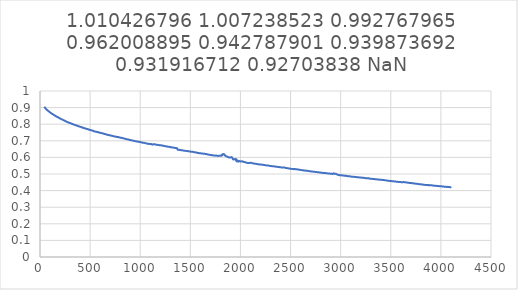
| Category | 1.010426796 |
|---|---|
| 42.6115265789308 | 0.905 |
| 47.3459460682923 | 0.901 |
| 52.080368193064 | 0.898 |
| 56.8147819223978 | 0.894 |
| 61.5491790028845 | 0.891 |
| 66.2835925270667 | 0.888 |
| 71.0180053884512 | 0.886 |
| 75.7524161509762 | 0.883 |
| 80.4868064141149 | 0.88 |
| 85.2212255720779 | 0.878 |
| 89.9555989654366 | 0.876 |
| 94.6899918797663 | 0.873 |
| 99.4244019005891 | 0.871 |
| 104.158789970183 | 0.869 |
| 108.893202405483 | 0.867 |
| 113.627562416641 | 0.865 |
| 118.361975135997 | 0.863 |
| 123.096343826648 | 0.862 |
| 127.830744568303 | 0.86 |
| 132.565132590554 | 0.858 |
| 137.299504248015 | 0.856 |
| 142.033897146563 | 0.855 |
| 146.76828368541 | 0.852 |
| 151.502642544562 | 0.851 |
| 156.23702419133 | 0.849 |
| 160.971399999167 | 0.847 |
| 165.705798405249 | 0.846 |
| 170.440168973827 | 0.844 |
| 175.174535802332 | 0.843 |
| 179.908915176651 | 0.841 |
| 184.643291347448 | 0.84 |
| 189.377650096134 | 0.838 |
| 194.112046829441 | 0.837 |
| 198.846403400362 | 0.834 |
| 203.580776683255 | 0.834 |
| 208.315159292658 | 0.832 |
| 213.049518988198 | 0.831 |
| 217.78387750017 | 0.829 |
| 222.518266406152 | 0.828 |
| 227.252620404787 | 0.827 |
| 231.987003456055 | 0.825 |
| 236.721373061999 | 0.824 |
| 241.455741342346 | 0.822 |
| 246.1901012746 | 0.821 |
| 250.924445157679 | 0.82 |
| 255.658818803533 | 0.818 |
| 260.393196315706 | 0.816 |
| 265.127644794577 | 0.815 |
| 269.862101889818 | 0.814 |
| 274.596581409715 | 0.813 |
| 279.331035680176 | 0.812 |
| 284.065502070366 | 0.81 |
| 288.79995798204 | 0.809 |
| 293.534420032483 | 0.808 |
| 298.268885254887 | 0.807 |
| 303.003323349927 | 0.806 |
| 307.73775658445 | 0.805 |
| 312.472210207894 | 0.804 |
| 317.206646030485 | 0.803 |
| 321.941079296571 | 0.801 |
| 326.675521668234 | 0.801 |
| 331.409941678365 | 0.799 |
| 336.144382093198 | 0.798 |
| 340.878795585818 | 0.797 |
| 345.613195901389 | 0.796 |
| 350.347627431575 | 0.795 |
| 355.082053217515 | 0.794 |
| 359.816464090507 | 0.793 |
| 364.5508648006 | 0.793 |
| 369.285266126148 | 0.791 |
| 374.019699550042 | 0.79 |
| 378.754099344843 | 0.789 |
| 383.488481165202 | 0.788 |
| 388.222892811457 | 0.787 |
| 392.957287871989 | 0.786 |
| 397.691706177783 | 0.786 |
| 402.426074458131 | 0.784 |
| 407.160494278891 | 0.784 |
| 411.894883374244 | 0.782 |
| 416.629256167928 | 0.782 |
| 421.363651970162 | 0.781 |
| 426.098049145334 | 0.779 |
| 430.832440102832 | 0.779 |
| 435.566824353449 | 0.777 |
| 440.301216668104 | 0.776 |
| 445.035598740957 | 0.776 |
| 449.769963533727 | 0.775 |
| 454.504346979518 | 0.774 |
| 459.238751729521 | 0.773 |
| 463.973111172566 | 0.772 |
| 468.707487895694 | 0.771 |
| 473.441859916115 | 0.771 |
| 478.176261872899 | 0.77 |
| 482.910640331926 | 0.768 |
| 487.644986124495 | 0.767 |
| 492.379361237971 | 0.767 |
| 497.113753221228 | 0.766 |
| 501.848109476532 | 0.765 |
| 506.582481575857 | 0.764 |
| 511.316854211733 | 0.764 |
| 516.051235527102 | 0.763 |
| 520.785611808366 | 0.762 |
| 525.519970067843 | 0.761 |
| 530.254339831596 | 0.76 |
| 534.988715418499 | 0.758 |
| 539.723080195488 | 0.758 |
| 544.457459459341 | 0.757 |
| 549.191821143273 | 0.756 |
| 553.926182574712 | 0.755 |
| 558.660561807003 | 0.755 |
| 563.394897768072 | 0.754 |
| 568.12927835752 | 0.753 |
| 572.863637595414 | 0.753 |
| 577.598004597509 | 0.752 |
| 582.332379284901 | 0.751 |
| 587.066730395632 | 0.75 |
| 591.801076787875 | 0.75 |
| 596.535453653031 | 0.749 |
| 601.269821002307 | 0.749 |
| 606.004166337229 | 0.747 |
| 610.738532345127 | 0.747 |
| 615.472902124661 | 0.746 |
| 620.207259311038 | 0.746 |
| 624.94162274665 | 0.745 |
| 629.675983483729 | 0.744 |
| 634.410339912622 | 0.743 |
| 639.144703537605 | 0.742 |
| 643.879069198324 | 0.741 |
| 648.613410572241 | 0.741 |
| 653.347774796899 | 0.74 |
| 658.082124771405 | 0.739 |
| 662.816479164563 | 0.738 |
| 667.550838891664 | 0.737 |
| 672.285213926236 | 0.737 |
| 677.019554085024 | 0.736 |
| 681.753929908641 | 0.734 |
| 686.488278194592 | 0.735 |
| 691.222651477484 | 0.733 |
| 695.956983430205 | 0.733 |
| 700.691342305138 | 0.733 |
| 705.425702631913 | 0.732 |
| 710.160075536064 | 0.73 |
| 714.894417809493 | 0.73 |
| 719.628792528447 | 0.73 |
| 724.363147316128 | 0.729 |
| 729.097482393466 | 0.728 |
| 733.831850105702 | 0.727 |
| 738.566216713275 | 0.727 |
| 743.300563279107 | 0.726 |
| 748.034920244551 | 0.726 |
| 752.769256947323 | 0.726 |
| 757.50364138731 | 0.724 |
| 762.237971320076 | 0.724 |
| 766.972330589532 | 0.723 |
| 771.706685314088 | 0.723 |
| 776.441052489773 | 0.722 |
| 781.175515329261 | 0.722 |
| 785.910099239798 | 0.721 |
| 790.644673539768 | 0.721 |
| 795.379245519946 | 0.72 |
| 800.113782450749 | 0.719 |
| 804.848345072854 | 0.719 |
| 809.582890209725 | 0.718 |
| 814.317418760872 | 0.718 |
| 819.05193905861 | 0.717 |
| 823.786481354919 | 0.716 |
| 828.520993541274 | 0.716 |
| 833.25550503327 | 0.715 |
| 837.990001328262 | 0.715 |
| 842.724495713765 | 0.713 |
| 847.45899241906 | 0.712 |
| 852.193486457383 | 0.712 |
| 856.927964509657 | 0.711 |
| 861.662445355149 | 0.71 |
| 866.396912471261 | 0.71 |
| 871.131374647951 | 0.709 |
| 875.86586264219 | 0.708 |
| 880.600300705669 | 0.708 |
| 885.334766480404 | 0.707 |
| 890.069210887804 | 0.706 |
| 894.803659540264 | 0.705 |
| 899.538133347476 | 0.705 |
| 904.272560727287 | 0.704 |
| 909.006992967614 | 0.703 |
| 913.741452619361 | 0.703 |
| 918.475871509048 | 0.703 |
| 923.210286437731 | 0.702 |
| 927.944716847473 | 0.701 |
| 932.679156378575 | 0.7 |
| 937.413567251567 | 0.699 |
| 942.147986441091 | 0.699 |
| 946.882398623897 | 0.698 |
| 951.616835235533 | 0.698 |
| 956.351243473114 | 0.697 |
| 961.085639196443 | 0.697 |
| 965.820052468132 | 0.696 |
| 970.554446297753 | 0.695 |
| 975.288865503058 | 0.695 |
| 980.02327901146 | 0.694 |
| 984.75767298311 | 0.694 |
| 989.492078159197 | 0.693 |
| 994.226455371533 | 0.693 |
| 998.960852373115 | 0.692 |
| 1003.69526577105 | 0.693 |
| 1008.42963761788 | 0.691 |
| 1013.1640314475 | 0.69 |
| 1017.89842114253 | 0.689 |
| 1022.63282655533 | 0.688 |
| 1027.36722636591 | 0.689 |
| 1032.10160695536 | 0.689 |
| 1036.83597196906 | 0.688 |
| 1041.57037252135 | 0.687 |
| 1046.3047376613 | 0.686 |
| 1051.03913384227 | 0.686 |
| 1055.77350161763 | 0.685 |
| 1060.5078888824 | 0.684 |
| 1065.24228761988 | 0.684 |
| 1069.9766381625 | 0.684 |
| 1074.71102896219 | 0.682 |
| 1079.4453919875 | 0.682 |
| 1084.17978387607 | 0.681 |
| 1088.91416418146 | 0.681 |
| 1093.64853433973 | 0.681 |
| 1098.38290565001 | 0.68 |
| 1103.11727542955 | 0.68 |
| 1107.85164554048 | 0.68 |
| 1112.58603387835 | 0.679 |
| 1117.32038732465 | 0.678 |
| 1122.05476826128 | 0.677 |
| 1126.78912890367 | 0.677 |
| 1131.52349036667 | 0.68 |
| 1136.25788309163 | 0.68 |
| 1140.99223862102 | 0.679 |
| 1145.72661217218 | 0.679 |
| 1150.46097417173 | 0.678 |
| 1155.19532480904 | 0.677 |
| 1159.92970427804 | 0.676 |
| 1164.66407816061 | 0.676 |
| 1169.39843301141 | 0.676 |
| 1174.13280073943 | 0.675 |
| 1178.86714616904 | 0.675 |
| 1183.60151277661 | 0.675 |
| 1188.33589775315 | 0.674 |
| 1193.07026399776 | 0.673 |
| 1197.80460169473 | 0.673 |
| 1202.53898955917 | 0.672 |
| 1207.27334826051 | 0.673 |
| 1212.00768840352 | 0.672 |
| 1216.74206848798 | 0.672 |
| 1221.47643171844 | 0.671 |
| 1226.21077329751 | 0.67 |
| 1230.94515185122 | 0.67 |
| 1235.6795132511 | 0.67 |
| 1240.41387034279 | 0.669 |
| 1245.14823314717 | 0.668 |
| 1249.88259222725 | 0.667 |
| 1254.61695537881 | 0.667 |
| 1259.35130636329 | 0.667 |
| 1264.08565333943 | 0.666 |
| 1268.82003476526 | 0.665 |
| 1273.55437329862 | 0.665 |
| 1278.28872410951 | 0.664 |
| 1283.02310338915 | 0.664 |
| 1287.75744269577 | 0.664 |
| 1292.49182563657 | 0.663 |
| 1297.22624814008 | 0.663 |
| 1301.96083511211 | 0.662 |
| 1306.69540993285 | 0.661 |
| 1311.42997501678 | 0.661 |
| 1316.16453509816 | 0.66 |
| 1320.8990681153 | 0.66 |
| 1325.63363946424 | 0.66 |
| 1330.3681731284 | 0.659 |
| 1335.10268979653 | 0.658 |
| 1339.83721028364 | 0.658 |
| 1344.57175341633 | 0.658 |
| 1349.30625577119 | 0.657 |
| 1354.04076972501 | 0.657 |
| 1358.77526497846 | 0.656 |
| 1363.50975914303 | 0.655 |
| 1368.24424170864 | 0.655 |
| 1372.97873932923 | 0.647 |
| 1377.71321001182 | 0.647 |
| 1382.44770049944 | 0.646 |
| 1387.18218581093 | 0.646 |
| 1391.91665166457 | 0.645 |
| 1396.65111440937 | 0.644 |
| 1401.38554977432 | 0.644 |
| 1406.12002020442 | 0.644 |
| 1410.85448313859 | 0.643 |
| 1415.58891064465 | 0.643 |
| 1420.32335328459 | 0.643 |
| 1425.05782092147 | 0.642 |
| 1429.79225881136 | 0.642 |
| 1434.5266733613 | 0.641 |
| 1439.26112152455 | 0.64 |
| 1443.99554874655 | 0.64 |
| 1448.72998930341 | 0.64 |
| 1453.46438797777 | 0.639 |
| 1458.19881464744 | 0.639 |
| 1462.93325267935 | 0.639 |
| 1467.6676609485 | 0.638 |
| 1472.40206118516 | 0.638 |
| 1477.13650237326 | 0.637 |
| 1481.87090658671 | 0.637 |
| 1486.6053160552 | 0.636 |
| 1491.33970063722 | 0.636 |
| 1496.07412006346 | 0.636 |
| 1500.80852972132 | 0.635 |
| 1505.54293485006 | 0.635 |
| 1510.27730783312 | 0.634 |
| 1515.01172059982 | 0.634 |
| 1519.74612673854 | 0.634 |
| 1524.48050696503 | 0.633 |
| 1529.21490548158 | 0.633 |
| 1533.94928952704 | 0.633 |
| 1538.6836829937 | 0.631 |
| 1543.41808515564 | 0.631 |
| 1548.15246481401 | 0.631 |
| 1552.88685111615 | 0.63 |
| 1557.62123544567 | 0.629 |
| 1562.3556248882 | 0.629 |
| 1567.08998881302 | 0.628 |
| 1571.82437146977 | 0.628 |
| 1576.55876886587 | 0.627 |
| 1581.29315463145 | 0.626 |
| 1586.02753312204 | 0.626 |
| 1590.76191229121 | 0.625 |
| 1595.49628110811 | 0.625 |
| 1600.23065961448 | 0.624 |
| 1604.96501877347 | 0.625 |
| 1609.69941708486 | 0.624 |
| 1614.4337760387 | 0.624 |
| 1619.168168811 | 0.624 |
| 1623.90254540788 | 0.623 |
| 1628.63689708673 | 0.622 |
| 1633.3712735258 | 0.622 |
| 1638.10563156434 | 0.622 |
| 1642.84000195933 | 0.621 |
| 1647.57438308533 | 0.621 |
| 1652.30876050282 | 0.621 |
| 1657.04311398069 | 0.621 |
| 1661.77749728445 | 0.62 |
| 1666.51184351888 | 0.619 |
| 1671.24624033109 | 0.618 |
| 1675.9805779176 | 0.618 |
| 1680.71495801784 | 0.617 |
| 1685.44931967021 | 0.616 |
| 1690.18368015479 | 0.616 |
| 1694.918051686 | 0.615 |
| 1699.65240481669 | 0.615 |
| 1704.38678925668 | 0.614 |
| 1709.12113320288 | 0.615 |
| 1713.85550078887 | 0.613 |
| 1718.58987519221 | 0.613 |
| 1723.32421940668 | 0.613 |
| 1728.05859425189 | 0.612 |
| 1732.79296638277 | 0.612 |
| 1737.52733030759 | 0.612 |
| 1742.26169145497 | 0.611 |
| 1746.9960557901 | 0.611 |
| 1751.7304063485 | 0.611 |
| 1756.46476358222 | 0.611 |
| 1761.19913014245 | 0.611 |
| 1765.93348133208 | 0.61 |
| 1770.66784105918 | 0.61 |
| 1775.40221497331 | 0.609 |
| 1780.136573722 | 0.609 |
| 1784.87093224975 | 0.61 |
| 1789.60529969371 | 0.609 |
| 1794.33965517575 | 0.61 |
| 1799.0740084169 | 0.611 |
| 1803.80837578196 | 0.61 |
| 1808.54272648239 | 0.611 |
| 1813.27709146453 | 0.611 |
| 1818.01166387079 | 0.618 |
| 1822.74624950144 | 0.615 |
| 1827.48079163994 | 0.62 |
| 1832.21535473548 | 0.62 |
| 1836.94991352282 | 0.619 |
| 1841.68445206328 | 0.617 |
| 1846.41896873141 | 0.611 |
| 1851.15349128582 | 0.609 |
| 1855.88802042086 | 0.607 |
| 1860.62252495348 | 0.606 |
| 1865.35704430436 | 0.605 |
| 1870.0915572482 | 0.604 |
| 1874.82605417443 | 0.602 |
| 1879.5605469345 | 0.601 |
| 1884.29501862707 | 0.6 |
| 1889.02950327576 | 0.6 |
| 1893.76399553084 | 0.6 |
| 1898.49846572423 | 0.599 |
| 1903.23294791109 | 0.6 |
| 1907.96739795227 | 0.602 |
| 1912.70187117559 | 0.6 |
| 1917.436317887 | 0.599 |
| 1922.17078112101 | 0.594 |
| 1926.90521056812 | 0.588 |
| 1931.63967855218 | 0.588 |
| 1936.37410440125 | 0.588 |
| 1941.10853907183 | 0.59 |
| 1945.84298867115 | 0.588 |
| 1955.31186350407 | 0.59 |
| 1960.04629107325 | 0.577 |
| 1964.78069411892 | 0.584 |
| 1969.51513656949 | 0.576 |
| 1974.24954755294 | 0.576 |
| 1978.98396754729 | 0.574 |
| 1983.71837603737 | 0.579 |
| 1988.45280185487 | 0.578 |
| 1993.18720722033 | 0.576 |
| 1997.92162156512 | 0.577 |
| 2002.65602610997 | 0.576 |
| 2007.39041856665 | 0.576 |
| 2012.12481523684 | 0.575 |
| 2016.85922551015 | 0.577 |
| 2021.59362044444 | 0.575 |
| 2026.32804136986 | 0.575 |
| 2031.06243807161 | 0.573 |
| 2035.79682102819 | 0.572 |
| 2040.5312037165 | 0.573 |
| 2045.26561239594 | 0.571 |
| 2050.00000595729 | 0.571 |
| 2054.73437635228 | 0.568 |
| 2059.4687958732 | 0.567 |
| 2092.60946479673 | 0.567 |
| 2097.343847848 | 0.568 |
| 2102.07821972639 | 0.567 |
| 2106.81261137825 | 0.567 |
| 2111.54698088951 | 0.566 |
| 2116.28136657619 | 0.565 |
| 2121.01572556159 | 0.565 |
| 2125.75011355228 | 0.564 |
| 2130.48448068062 | 0.564 |
| 2135.21886641464 | 0.563 |
| 2139.95321430607 | 0.562 |
| 2144.68758768364 | 0.562 |
| 2149.42196819419 | 0.561 |
| 2154.15635182935 | 0.561 |
| 2158.89070309789 | 0.561 |
| 2163.62508187254 | 0.56 |
| 2168.35944978992 | 0.559 |
| 2173.093824572 | 0.559 |
| 2177.82819378342 | 0.558 |
| 2182.56254135923 | 0.559 |
| 2187.29692232742 | 0.557 |
| 2192.03128323809 | 0.558 |
| 2196.76566521626 | 0.557 |
| 2201.50001852053 | 0.557 |
| 2206.23438591715 | 0.557 |
| 2210.96876268762 | 0.556 |
| 2215.70312209911 | 0.556 |
| 2220.43747922236 | 0.556 |
| 2225.17185297868 | 0.556 |
| 2229.90621581462 | 0.555 |
| 2234.6405611022 | 0.555 |
| 2239.37494667841 | 0.554 |
| 2244.10930902514 | 0.553 |
| 2248.84366043571 | 0.553 |
| 2253.57800970007 | 0.552 |
| 2258.31238610758 | 0.552 |
| 2263.04675194189 | 0.551 |
| 2267.78110082752 | 0.551 |
| 2272.51548200086 | 0.552 |
| 2277.2498207078 | 0.551 |
| 2281.9841782098 | 0.55 |
| 2286.71854761059 | 0.55 |
| 2291.45289045213 | 0.549 |
| 2296.18726184131 | 0.549 |
| 2300.92162586082 | 0.548 |
| 2305.65597559861 | 0.548 |
| 2310.39033920782 | 0.548 |
| 2315.12470565758 | 0.547 |
| 2319.85905110297 | 0.547 |
| 2324.59341905192 | 0.546 |
| 2329.32777574909 | 0.546 |
| 2334.06231948146 | 0.546 |
| 2338.79689232958 | 0.546 |
| 2343.5314505646 | 0.545 |
| 2348.26603398593 | 0.544 |
| 2353.00057658207 | 0.545 |
| 2357.73511256602 | 0.545 |
| 2362.46963680899 | 0.543 |
| 2367.20417894749 | 0.543 |
| 2371.93869062885 | 0.542 |
| 2376.67322344084 | 0.542 |
| 2381.4077381837 | 0.542 |
| 2386.14223286904 | 0.542 |
| 2390.87674704379 | 0.541 |
| 2395.61122020399 | 0.541 |
| 2400.34572800325 | 0.54 |
| 2405.08021274663 | 0.54 |
| 2409.81467867917 | 0.539 |
| 2414.54915665254 | 0.54 |
| 2419.28362618313 | 0.539 |
| 2424.01812288843 | 0.539 |
| 2428.75255953162 | 0.538 |
| 2433.48704115038 | 0.539 |
| 2438.22147476364 | 0.538 |
| 2442.95594105915 | 0.538 |
| 2447.69037601379 | 0.537 |
| 2452.42484737496 | 0.536 |
| 2457.15927499149 | 0.536 |
| 2461.89371976185 | 0.536 |
| 2466.62816469002 | 0.535 |
| 2471.36259535225 | 0.534 |
| 2476.09701880262 | 0.534 |
| 2480.83144657695 | 0.533 |
| 2485.56586035363 | 0.533 |
| 2490.30029890632 | 0.533 |
| 2495.03469941126 | 0.532 |
| 2499.76912204102 | 0.532 |
| 2504.503551425 | 0.531 |
| 2509.23796950986 | 0.531 |
| 2513.97238115612 | 0.53 |
| 2518.70677531714 | 0.53 |
| 2523.44117132453 | 0.53 |
| 2528.17557937274 | 0.53 |
| 2532.91000899343 | 0.529 |
| 2537.64438434363 | 0.53 |
| 2542.37880738369 | 0.53 |
| 2547.1131965106 | 0.529 |
| 2551.84758413833 | 0.529 |
| 2556.58197471709 | 0.529 |
| 2561.31636700018 | 0.528 |
| 2566.05078042968 | 0.528 |
| 2570.78516239207 | 0.527 |
| 2575.51956543773 | 0.526 |
| 2580.25393308684 | 0.526 |
| 2584.98834392827 | 0.525 |
| 2589.72272282916 | 0.525 |
| 2594.45711362885 | 0.525 |
| 2599.1914903362 | 0.525 |
| 2603.92586830602 | 0.524 |
| 2608.66025847447 | 0.524 |
| 2613.39463707553 | 0.523 |
| 2618.12902249393 | 0.522 |
| 2622.86338356241 | 0.522 |
| 2627.59778804414 | 0.522 |
| 2632.33216669254 | 0.522 |
| 2637.06652687728 | 0.521 |
| 2641.80091863961 | 0.521 |
| 2646.53528400049 | 0.521 |
| 2651.26964964543 | 0.52 |
| 2656.00403858297 | 0.52 |
| 2660.73839516967 | 0.52 |
| 2665.47277675332 | 0.519 |
| 2670.20715841587 | 0.519 |
| 2674.94153005755 | 0.519 |
| 2679.67589515015 | 0.518 |
| 2684.41025912232 | 0.517 |
| 2689.14462705548 | 0.517 |
| 2693.87899921793 | 0.516 |
| 2698.61336797171 | 0.516 |
| 2703.3477276199 | 0.516 |
| 2708.08211646276 | 0.515 |
| 2712.81645917806 | 0.515 |
| 2760.1601249066 | 0.512 |
| 2764.89448850002 | 0.511 |
| 2769.62885248797 | 0.511 |
| 2774.36321066854 | 0.51 |
| 2779.09756491967 | 0.511 |
| 2783.83194423087 | 0.51 |
| 2788.56630667228 | 0.509 |
| 2793.30066488442 | 0.509 |
| 2798.03502820956 | 0.509 |
| 2802.76939380716 | 0.508 |
| 2807.50375566468 | 0.507 |
| 2812.23810639667 | 0.507 |
| 2816.97247028993 | 0.507 |
| 2821.70684212098 | 0.507 |
| 2826.44118496252 | 0.506 |
| 2831.1755702389 | 0.507 |
| 2835.90992305396 | 0.506 |
| 2840.64428761002 | 0.506 |
| 2845.37864332877 | 0.505 |
| 2850.11313990782 | 0.505 |
| 2854.84771191956 | 0.505 |
| 2859.58226846602 | 0.504 |
| 2864.31682518607 | 0.504 |
| 2869.0513730846 | 0.504 |
| 2873.78591519154 | 0.503 |
| 2878.52045114392 | 0.503 |
| 2883.25499243026 | 0.503 |
| 2887.98950019796 | 0.503 |
| 2892.72403226825 | 0.503 |
| 2897.4585247127 | 0.502 |
| 2902.19305687767 | 0.502 |
| 2906.92755569761 | 0.501 |
| 2911.66203578562 | 0.501 |
| 2916.39652928739 | 0.501 |
| 2921.13101369936 | 0.5 |
| 2925.865513261 | 0.501 |
| 2930.59996339687 | 0.504 |
| 2935.33444159117 | 0.502 |
| 2940.06892980634 | 0.501 |
| 2944.80336195198 | 0.501 |
| 2949.53782403399 | 0.501 |
| 2954.27228802548 | 0.501 |
| 2959.00673413722 | 0.499 |
| 2963.74118231625 | 0.497 |
| 2968.47562558743 | 0.496 |
| 2973.21009961557 | 0.495 |
| 2977.94450865798 | 0.494 |
| 2982.67896486949 | 0.494 |
| 2987.41339128667 | 0.493 |
| 2992.14783121229 | 0.493 |
| 2996.88226174828 | 0.492 |
| 3001.61667224253 | 0.492 |
| 3006.35109228422 | 0.492 |
| 3011.08550677104 | 0.492 |
| 3015.81992678117 | 0.492 |
| 3020.55433825384 | 0.491 |
| 3025.28877107806 | 0.491 |
| 3030.02316123073 | 0.491 |
| 3034.75758351331 | 0.49 |
| 3039.49200704258 | 0.49 |
| 3044.22638431804 | 0.489 |
| 3048.96081007242 | 0.489 |
| 3053.69521614802 | 0.489 |
| 3058.42959037776 | 0.488 |
| 3063.16402662644 | 0.487 |
| 3067.89840405971 | 0.487 |
| 3072.632800146 | 0.487 |
| 3077.36720279714 | 0.487 |
| 3082.10159506445 | 0.486 |
| 3086.83598475948 | 0.486 |
| 3091.57037177175 | 0.486 |
| 3096.30474742178 | 0.486 |
| 3101.03914174061 | 0.484 |
| 3105.77353640662 | 0.484 |
| 3110.50789775915 | 0.484 |
| 3115.24228739106 | 0.484 |
| 3119.97667845902 | 0.483 |
| 3124.71105019539 | 0.484 |
| 3129.44544161053 | 0.483 |
| 3134.17981774976 | 0.483 |
| 3138.91420129024 | 0.482 |
| 3143.64856999667 | 0.482 |
| 3148.38295461025 | 0.481 |
| 3153.11735547815 | 0.482 |
| 3157.85171840878 | 0.481 |
| 3162.58610370093 | 0.481 |
| 3167.32047974548 | 0.481 |
| 3172.05485001422 | 0.481 |
| 3176.78920489659 | 0.48 |
| 3181.5235995626 | 0.48 |
| 3186.25795218829 | 0.479 |
| 3190.99232269375 | 0.48 |
| 3195.72669744427 | 0.479 |
| 3200.46106867564 | 0.479 |
| 3205.1954663558 | 0.478 |
| 3209.92983324743 | 0.478 |
| 3214.66419092302 | 0.477 |
| 3219.39855757793 | 0.478 |
| 3224.13293336999 | 0.477 |
| 3228.86730363873 | 0.477 |
| 3233.60166407597 | 0.476 |
| 3238.33603537047 | 0.476 |
| 3243.07038488733 | 0.476 |
| 3247.80477622357 | 0.475 |
| 3252.53911627189 | 0.475 |
| 3257.27350412055 | 0.475 |
| 3262.00787131202 | 0.474 |
| 3266.74221326983 | 0.475 |
| 3271.47657825197 | 0.475 |
| 3276.21096161885 | 0.474 |
| 3280.94532961515 | 0.474 |
| 3285.67970048356 | 0.473 |
| 3290.41405718073 | 0.472 |
| 3295.14841834389 | 0.472 |
| 3299.88278479366 | 0.471 |
| 3304.61712965515 | 0.472 |
| 3309.35150489488 | 0.471 |
| 3314.08587227571 | 0.471 |
| 3318.82023241312 | 0.47 |
| 3323.55457779538 | 0.47 |
| 3328.28896070462 | 0.47 |
| 3333.02330009015 | 0.469 |
| 3337.75768064803 | 0.469 |
| 3342.49203516744 | 0.469 |
| 3347.22639150165 | 0.469 |
| 3351.96077093909 | 0.468 |
| 3356.69510731046 | 0.468 |
| 3361.42948960425 | 0.467 |
| 3366.16391613189 | 0.468 |
| 3370.89849664953 | 0.467 |
| 3375.6330412972 | 0.467 |
| 3380.36761365612 | 0.466 |
| 3385.10217032882 | 0.466 |
| 3389.83670172053 | 0.466 |
| 3394.57124627351 | 0.465 |
| 3399.3057825573 | 0.465 |
| 3404.04030724212 | 0.466 |
| 3408.77482159046 | 0.465 |
| 3413.50930652321 | 0.465 |
| 3418.24382399616 | 0.464 |
| 3422.97831172213 | 0.464 |
| 3427.7128302524 | 0.464 |
| 3432.44732110299 | 0.463 |
| 3437.18179427896 | 0.463 |
| 3441.91625965917 | 0.462 |
| 3446.65074446567 | 0.462 |
| 3451.3852073525 | 0.462 |
| 3456.1196714229 | 0.461 |
| 3460.85416211567 | 0.461 |
| 3465.58860420328 | 0.46 |
| 3470.32307663756 | 0.46 |
| 3475.05750971427 | 0.459 |
| 3479.79197148066 | 0.459 |
| 3484.52642125356 | 0.459 |
| 3489.26085278375 | 0.458 |
| 3493.99529537634 | 0.458 |
| 3498.72971603349 | 0.458 |
| 3503.46417202407 | 0.458 |
| 3508.19860320708 | 0.457 |
| 3512.93301654189 | 0.456 |
| 3517.66743773559 | 0.456 |
| 3522.40186934468 | 0.456 |
| 3527.13627728242 | 0.456 |
| 3531.8706896546 | 0.456 |
| 3536.60513087426 | 0.455 |
| 3541.33953923809 | 0.454 |
| 3546.07394064254 | 0.455 |
| 3550.80836919014 | 0.454 |
| 3555.54274810681 | 0.454 |
| 3560.27717370338 | 0.454 |
| 3565.01158563369 | 0.453 |
| 3569.74597895832 | 0.453 |
| 3574.4803738137 | 0.453 |
| 3579.21475839572 | 0.452 |
| 3583.9491828245 | 0.452 |
| 3588.68355501851 | 0.451 |
| 3593.41796546542 | 0.452 |
| 3598.15235018946 | 0.451 |
| 3602.88674264615 | 0.451 |
| 3607.62114285125 | 0.45 |
| 3612.35554045251 | 0.45 |
| 3617.08991086328 | 0.451 |
| 3621.82429421438 | 0.451 |
| 3626.55872737 | 0.451 |
| 3631.29308952736 | 0.451 |
| 3636.0274569871 | 0.45 |
| 3640.76184172693 | 0.45 |
| 3645.49622125905 | 0.45 |
| 3650.23061336856 | 0.45 |
| 3654.96500959688 | 0.449 |
| 3659.69938780341 | 0.449 |
| 3664.43374577883 | 0.448 |
| 3669.1681316391 | 0.448 |
| 3673.90249641609 | 0.448 |
| 3678.63689428562 | 0.448 |
| 3683.3712660062 | 0.446 |
| 3688.10563745851 | 0.446 |
| 3692.84001749563 | 0.446 |
| 3697.57439887412 | 0.446 |
| 3702.30876859053 | 0.445 |
| 3707.04314076876 | 0.446 |
| 3711.77752019042 | 0.445 |
| 3716.51186574628 | 0.444 |
| 3721.24623869777 | 0.443 |
| 3725.98063893444 | 0.444 |
| 3730.71497701015 | 0.443 |
| 3735.44937301753 | 0.443 |
| 3740.18373176622 | 0.443 |
| 3744.91810856825 | 0.442 |
| 3749.65246917908 | 0.442 |
| 3754.38684980009 | 0.442 |
| 3759.12120592915 | 0.441 |
| 3763.85557987484 | 0.441 |
| 3768.58993832369 | 0.44 |
| 3773.32431435246 | 0.44 |
| 3778.05868130721 | 0.439 |
| 3782.79302410141 | 0.438 |
| 3787.527413828 | 0.438 |
| 3792.26177813156 | 0.438 |
| 3796.99615037291 | 0.438 |
| 3801.73050645462 | 0.438 |
| 3806.46487830145 | 0.438 |
| 3811.19923201603 | 0.436 |
| 3815.93360136948 | 0.436 |
| 3820.6679663674 | 0.436 |
| 3825.40232175476 | 0.436 |
| 3830.13667973018 | 0.435 |
| 3834.87106237114 | 0.435 |
| 3839.60541261393 | 0.434 |
| 3844.33976948469 | 0.434 |
| 3849.07413913797 | 0.434 |
| 3853.80851158448 | 0.434 |
| 3858.54285578318 | 0.433 |
| 3863.27724180125 | 0.433 |
| 3868.01159755157 | 0.434 |
| 3872.74596035594 | 0.434 |
| 3877.4803217716 | 0.432 |
| 3882.2147166901 | 0.433 |
| 3886.94927661368 | 0.433 |
| 3891.68385238127 | 0.432 |
| 3896.41840757057 | 0.432 |
| 3901.15294620571 | 0.432 |
| 3905.88747884411 | 0.432 |
| 3910.62202628499 | 0.432 |
| 3915.35654251126 | 0.431 |
| 3920.09106727499 | 0.431 |
| 3924.82560212271 | 0.43 |
| 3929.5600929733 | 0.43 |
| 3934.29462098789 | 0.43 |
| 3939.02911401624 | 0.429 |
| 3943.76359631357 | 0.429 |
| 3948.49810647997 | 0.429 |
| 3953.2325801925 | 0.429 |
| 3957.96706643506 | 0.428 |
| 3962.70153994244 | 0.428 |
| 3967.43600421799 | 0.428 |
| 3972.17047164972 | 0.427 |
| 3976.90493242191 | 0.427 |
| 3981.63941007966 | 0.427 |
| 3986.37387358194 | 0.426 |
| 3991.10830645351 | 0.426 |
| 3995.84275120809 | 0.426 |
| 4000.57721715641 | 0.426 |
| 4005.31166655057 | 0.426 |
| 4010.04607791277 | 0.425 |
| 4014.78052820645 | 0.425 |
| 4019.5149609991 | 0.425 |
| 4024.24939566969 | 0.426 |
| 4028.98382147141 | 0.424 |
| 4033.7182368893 | 0.424 |
| 4038.45265899829 | 0.423 |
| 4043.18708360066 | 0.423 |
| 4047.92151628286 | 0.424 |
| 4052.65591502034 | 0.423 |
| 4057.3903525157 | 0.422 |
| 4062.12474307868 | 0.422 |
| 4066.85917404076 | 0.422 |
| 4071.59357692861 | 0.422 |
| 4076.32798876424 | 0.421 |
| 4081.06237748085 | 0.421 |
| 4085.79678641279 | 0.421 |
| 4090.53120290378 | 0.421 |
| 4095.2655967334 | 0.42 |
| 4100.0 | 0.425 |